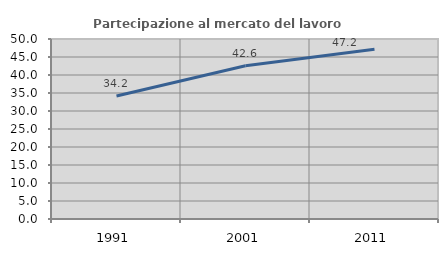
| Category | Partecipazione al mercato del lavoro  femminile |
|---|---|
| 1991.0 | 34.152 |
| 2001.0 | 42.553 |
| 2011.0 | 47.156 |